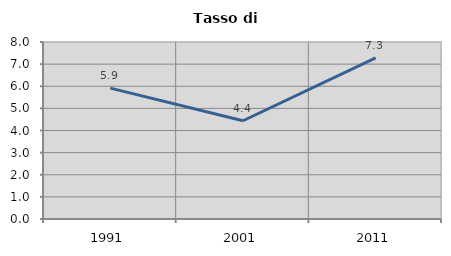
| Category | Tasso di disoccupazione   |
|---|---|
| 1991.0 | 5.914 |
| 2001.0 | 4.44 |
| 2011.0 | 7.278 |